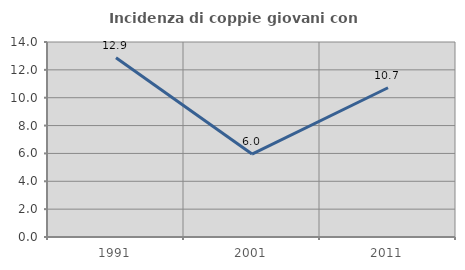
| Category | Incidenza di coppie giovani con figli |
|---|---|
| 1991.0 | 12.871 |
| 2001.0 | 5.952 |
| 2011.0 | 10.714 |